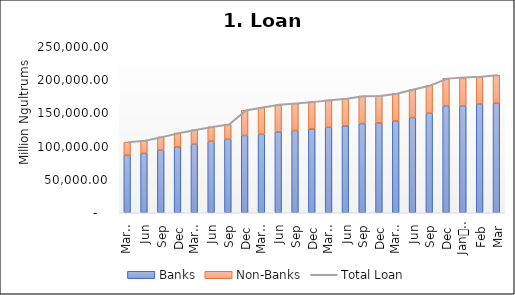
| Category | Banks | Non-Banks |
|---|---|---|
| 0 | 86839.062 | 19536.13 |
| 1 | 89492.789 | 19317.924 |
| 2 | 94257.106 | 19993.763 |
| 3 | 99542.627 | 20696.164 |
| 4 | 103455.022 | 21541.616 |
| 5 | 107823.786 | 21766.128 |
| 6 | 110793.514 | 22289.762 |
| 7 | 116541.685 | 37784.488 |
| 8 | 118433.441 | 40493.857 |
| 9 | 121831.338 | 40869.086 |
| 10 | 123947.936 | 40898.135 |
| 11 | 126363.799 | 40625.692 |
| 12 | 128951.639 | 40851.287 |
| 13 | 130897.833 | 41243.55 |
| 14 | 134359.87 | 41428.68 |
| 15 | 135415.887 | 40793.4 |
| 16 | 138284.661 | 41288.566 |
| 17 | 143532.338 | 42375.24 |
| 18 | 149966.968 | 41992.436 |
| 19 | 160873.72 | 41509.575 |
| 20 | 160873.72 | 41509.575 |
| 21 | 163784.222 | 41233.942 |
| 22 | 165428.061 | 41861.82 |